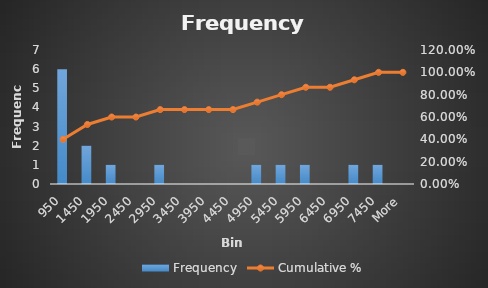
| Category | Frequency |
|---|---|
| 950 | 6 |
| 1450 | 2 |
| 1950 | 1 |
| 2450 | 0 |
| 2950 | 1 |
| 3450 | 0 |
| 3950 | 0 |
| 4450 | 0 |
| 4950 | 1 |
| 5450 | 1 |
| 5950 | 1 |
| 6450 | 0 |
| 6950 | 1 |
| 7450 | 1 |
| More | 0 |